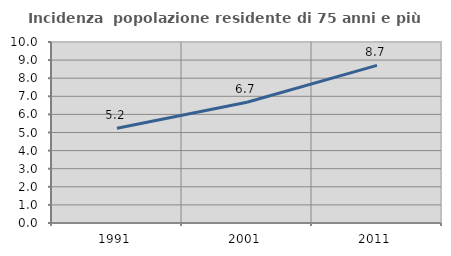
| Category | Incidenza  popolazione residente di 75 anni e più |
|---|---|
| 1991.0 | 5.23 |
| 2001.0 | 6.672 |
| 2011.0 | 8.708 |